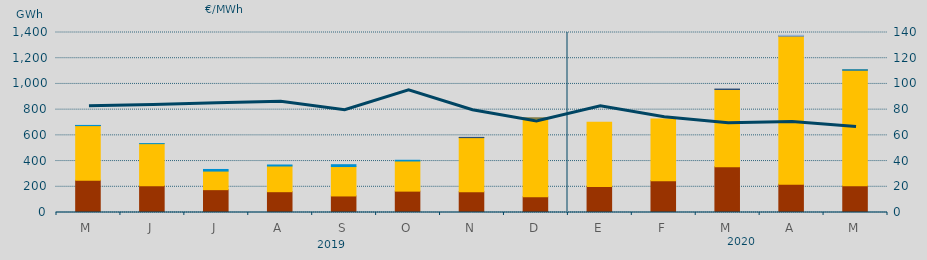
| Category | Carbón | Ciclo Combinado | Consumo Bombeo | Hidráulica | Otras Renovables | Turbinación bombeo |
|---|---|---|---|---|---|---|
| M | 250250 | 425915 | 190 | 880 | 0 | 0 |
| J | 209003 | 326625.6 | 0 | 334.5 | 0 | 0 |
| J | 177655 | 144531.3 | 0 | 12515 | 0 | 0 |
| A | 161808 | 199805.1 | 0 | 7890 | 0 | 0 |
| S | 128712 | 228795.2 | 0 | 14281 | 0 | 0 |
| O | 166180 | 234526.2 | 0 | 5517.1 | 0 | 0 |
| N | 161365 | 421030.7 | 0 | 0 | 1775.2 | 0 |
| D | 122168 | 612250.1 | 0 | 0 | 164.2 | 0 |
| E | 202940 | 498564 | 0 | 0 | 0 | 0 |
| F | 247227 | 479450.3 | 0 | 0 | 0 | 0 |
| M | 355297 | 601360.3 | 3495.6 | 0 | 0 | 0 |
| A | 220571 | 1152051.4 | 585 | 0 | 0 | 5000 |
| M | 207721 | 900435.9 | 185 | 630 | 0 | 0 |